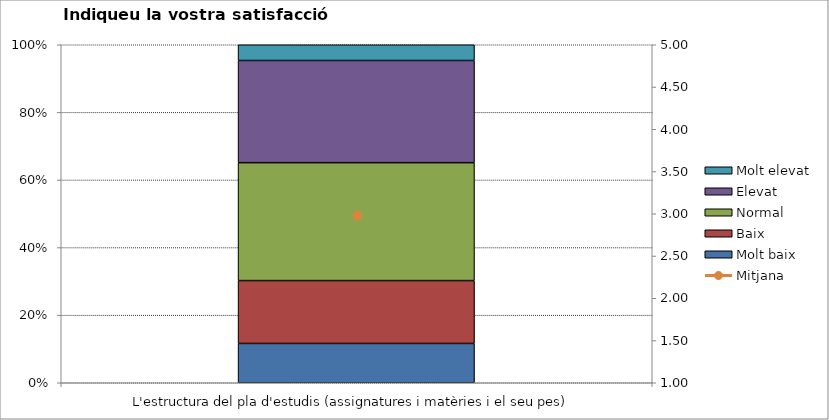
| Category | Molt baix | Baix | Normal  | Elevat | Molt elevat |
|---|---|---|---|---|---|
| L'estructura del pla d'estudis (assignatures i matèries i el seu pes) | 5 | 8 | 15 | 13 | 2 |